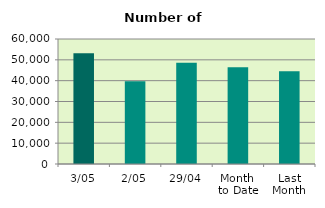
| Category | Series 0 |
|---|---|
| 3/05 | 53154 |
| 2/05 | 39704 |
| 29/04 | 48588 |
| Month 
to Date | 46429 |
| Last
Month | 44538 |